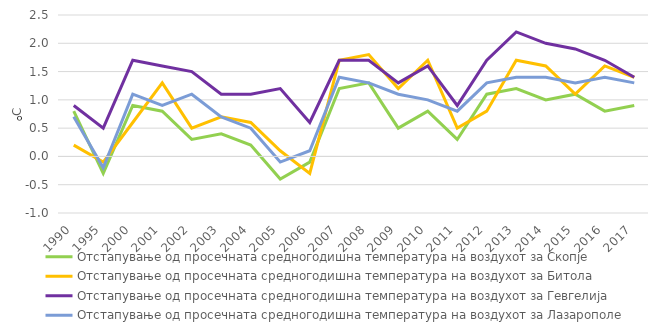
| Category | Отстапување од просечната средногодишна температура на воздухот за Скопје | Отстапување од просечната средногодишна температура на воздухот за Битола | Отстапување од просечната средногодишна температура на воздухот за Гевгелија | Отстапување од просечната средногодишна температура на воздухот за Лазарополе |
|---|---|---|---|---|
| 1990.0 | 0.8 | 0.2 | 0.9 | 0.7 |
| 1995.0 | -0.3 | -0.1 | 0.5 | -0.2 |
| 2000.0 | 0.9 | 0.6 | 1.7 | 1.1 |
| 2001.0 | 0.8 | 1.3 | 1.6 | 0.9 |
| 2002.0 | 0.3 | 0.5 | 1.5 | 1.1 |
| 2003.0 | 0.4 | 0.7 | 1.1 | 0.7 |
| 2004.0 | 0.2 | 0.6 | 1.1 | 0.5 |
| 2005.0 | -0.4 | 0.1 | 1.2 | -0.1 |
| 2006.0 | -0.1 | -0.3 | 0.6 | 0.1 |
| 2007.0 | 1.2 | 1.7 | 1.7 | 1.4 |
| 2008.0 | 1.3 | 1.8 | 1.7 | 1.3 |
| 2009.0 | 0.5 | 1.2 | 1.3 | 1.1 |
| 2010.0 | 0.8 | 1.7 | 1.6 | 1 |
| 2011.0 | 0.3 | 0.5 | 0.9 | 0.8 |
| 2012.0 | 1.1 | 0.8 | 1.7 | 1.3 |
| 2013.0 | 1.2 | 1.7 | 2.2 | 1.4 |
| 2014.0 | 1 | 1.6 | 2 | 1.4 |
| 2015.0 | 1.1 | 1.1 | 1.9 | 1.3 |
| 2016.0 | 0.8 | 1.6 | 1.7 | 1.4 |
| 2017.0 | 0.9 | 1.4 | 1.4 | 1.3 |